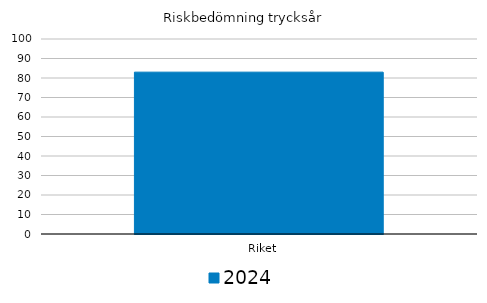
| Category | 2024 |
|---|---|
|   Riket | 83 |